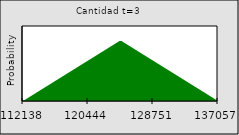
| Category | Series 0 |
|---|---|
| 112137.79478807 | 0 |
| nan | 0 |
| nan | 0.001 |
| nan | 0.001 |
| nan | 0.002 |
| nan | 0.002 |
| nan | 0.002 |
| nan | 0.003 |
| nan | 0.003 |
| nan | 0.004 |
| nan | 0.004 |
| nan | 0.004 |
| nan | 0.005 |
| nan | 0.005 |
| nan | 0.006 |
| nan | 0.006 |
| nan | 0.007 |
| nan | 0.007 |
| nan | 0.007 |
| nan | 0.008 |
| nan | 0.008 |
| nan | 0.009 |
| nan | 0.009 |
| nan | 0.009 |
| nan | 0.01 |
| nan | 0.01 |
| nan | 0.011 |
| nan | 0.011 |
| nan | 0.011 |
| nan | 0.012 |
| nan | 0.012 |
| nan | 0.013 |
| nan | 0.013 |
| 120444.29810570467 | 0.013 |
| nan | 0.014 |
| nan | 0.014 |
| nan | 0.015 |
| nan | 0.015 |
| nan | 0.016 |
| nan | 0.016 |
| nan | 0.016 |
| nan | 0.017 |
| nan | 0.017 |
| nan | 0.018 |
| nan | 0.018 |
| nan | 0.018 |
| nan | 0.019 |
| nan | 0.019 |
| nan | 0.02 |
| nan | 0.02 |
| nan | 0.02 |
| nan | 0.02 |
| nan | 0.019 |
| nan | 0.019 |
| nan | 0.018 |
| nan | 0.018 |
| nan | 0.018 |
| nan | 0.017 |
| nan | 0.017 |
| nan | 0.016 |
| nan | 0.016 |
| nan | 0.016 |
| nan | 0.015 |
| nan | 0.015 |
| nan | 0.014 |
| nan | 0.014 |
| 128750.80142333933 | 0.013 |
| nan | 0.013 |
| nan | 0.013 |
| nan | 0.012 |
| nan | 0.012 |
| nan | 0.011 |
| nan | 0.011 |
| nan | 0.011 |
| nan | 0.01 |
| nan | 0.01 |
| nan | 0.009 |
| nan | 0.009 |
| nan | 0.009 |
| nan | 0.008 |
| nan | 0.008 |
| nan | 0.007 |
| nan | 0.007 |
| nan | 0.007 |
| nan | 0.006 |
| nan | 0.006 |
| nan | 0.005 |
| nan | 0.005 |
| nan | 0.004 |
| nan | 0.004 |
| nan | 0.004 |
| nan | 0.003 |
| nan | 0.003 |
| nan | 0.002 |
| nan | 0.002 |
| nan | 0.002 |
| nan | 0.001 |
| nan | 0.001 |
| nan | 0 |
| 137057.304740974 | 0 |